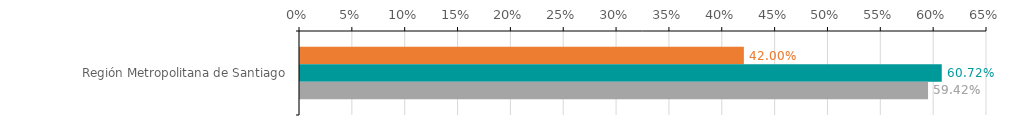
| Category | Numero de operaciones | Monto ($ MM) | Garantia ($ MM) |
|---|---|---|---|
| Región Metropolitana de Santiago | 0.42 | 0.607 | 0.594 |